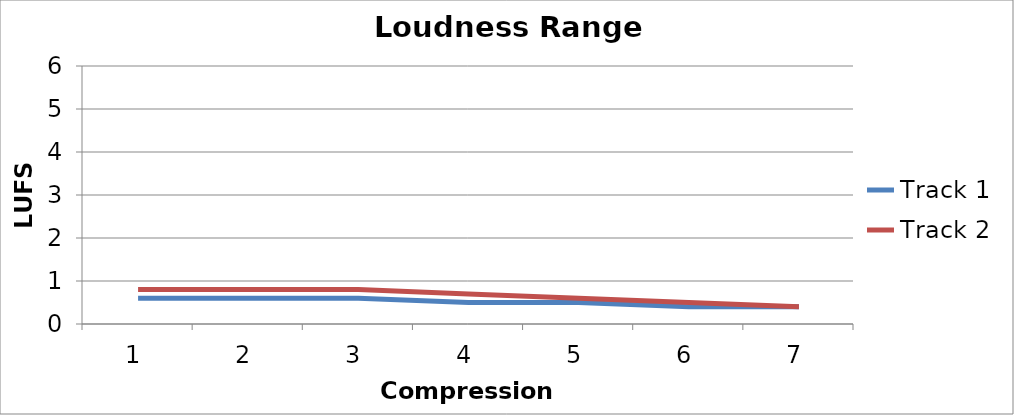
| Category | Track 1 | Track 2 |
|---|---|---|
| 0 | 0.6 | 0.8 |
| 1 | 0.6 | 0.8 |
| 2 | 0.6 | 0.8 |
| 3 | 0.5 | 0.7 |
| 4 | 0.5 | 0.6 |
| 5 | 0.4 | 0.5 |
| 6 | 0.4 | 0.4 |